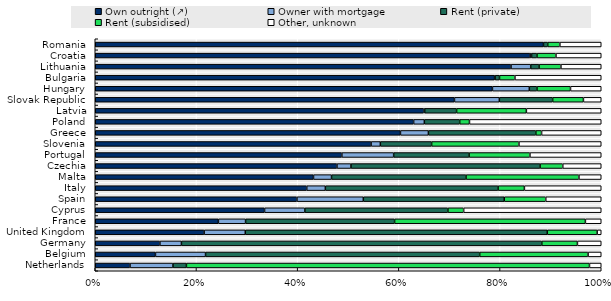
| Category | Own outright (↗) | Owner with mortgage | Rent (private) | Rent (subsidised) | Other, unknown |
|---|---|---|---|---|---|
| Netherlands | 0.069 | 0.085 | 0.027 | 0.797 | 0.023 |
| Belgium | 0.119 | 0.099 | 0.542 | 0.214 | 0.026 |
| Germany | 0.128 | 0.043 | 0.712 | 0.07 | 0.047 |
| United Kingdom | 0.215 | 0.081 | 0.597 | 0.099 | 0.008 |
| France | 0.243 | 0.054 | 0.294 | 0.377 | 0.031 |
| Cyprus | 0.335 | 0.08 | 0.283 | 0.031 | 0.272 |
| Spain | 0.399 | 0.131 | 0.279 | 0.082 | 0.11 |
| Italy | 0.418 | 0.037 | 0.341 | 0.052 | 0.152 |
| Malta | 0.431 | 0.036 | 0.266 | 0.223 | 0.044 |
| Czechia | 0.478 | 0.028 | 0.374 | 0.045 | 0.076 |
| Portugal | 0.487 | 0.102 | 0.149 | 0.12 | 0.141 |
| Slovenia | 0.545 | 0.018 | 0.101 | 0.173 | 0.163 |
| Greece | 0.603 | 0.055 | 0.212 | 0.011 | 0.118 |
| Poland | 0.629 | 0.021 | 0.07 | 0.019 | 0.26 |
| Latvia | 0.649 | 0.002 | 0.063 | 0.138 | 0.148 |
| Slovak Republic | 0.71 | 0.089 | 0.105 | 0.061 | 0.035 |
| Hungary | 0.785 | 0.073 | 0.015 | 0.066 | 0.061 |
| Bulgaria | 0.789 | 0.001 | 0.009 | 0.031 | 0.171 |
| Lithuania | 0.822 | 0.039 | 0.017 | 0.043 | 0.08 |
| Croatia | 0.859 | 0.003 | 0.011 | 0.038 | 0.089 |
| Romania | 0.886 | 0 | 0.008 | 0.024 | 0.082 |